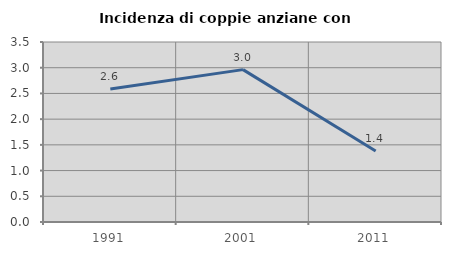
| Category | Incidenza di coppie anziane con figli |
|---|---|
| 1991.0 | 2.586 |
| 2001.0 | 2.963 |
| 2011.0 | 1.379 |